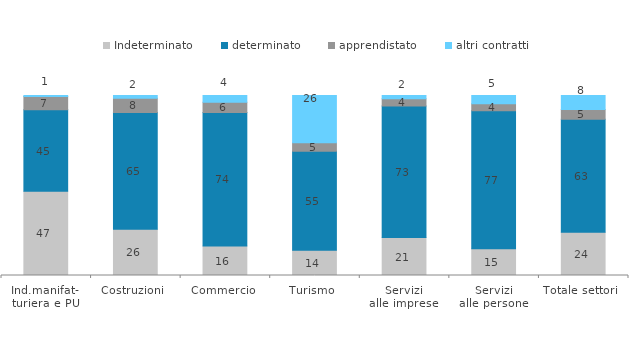
| Category | Indeterminato | determinato | apprendistato | altri contratti |
|---|---|---|---|---|
| Ind.manifat-
turiera e PU | 46.849 | 45.184 | 7.372 | 0.595 |
| Costruzioni | 25.752 | 64.85 | 7.895 | 1.504 |
| Commercio | 16.457 | 74.153 | 5.615 | 3.775 |
| Turismo | 14.067 | 55.008 | 4.707 | 26.218 |
| Servizi
alle imprese | 21.058 | 73.069 | 4.127 | 1.746 |
| Servizi
alle persone | 14.927 | 76.578 | 3.883 | 4.612 |
| Totale settori | 24.05 | 62.763 | 5.393 | 7.794 |